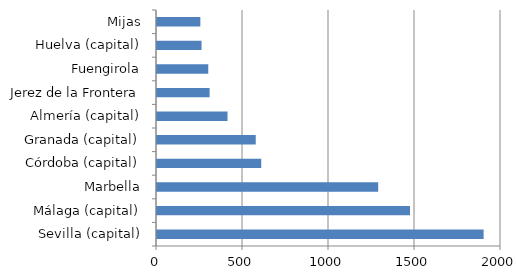
| Category | Series 0 |
|---|---|
| Sevilla (capital) | 1899 |
| Málaga (capital) | 1471 |
| Marbella | 1286 |
| Córdoba (capital) | 606 |
| Granada (capital) | 574 |
| Almería (capital) | 410 |
| Jerez de la Frontera | 306 |
| Fuengirola | 298 |
| Huelva (capital) | 259 |
| Mijas | 252 |